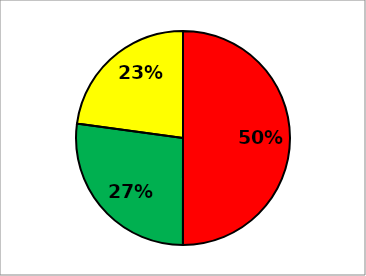
| Category | Series 0 |
|---|---|
| Red | 0.245 |
| Green | 0.133 |
| Yellow | 0.112 |